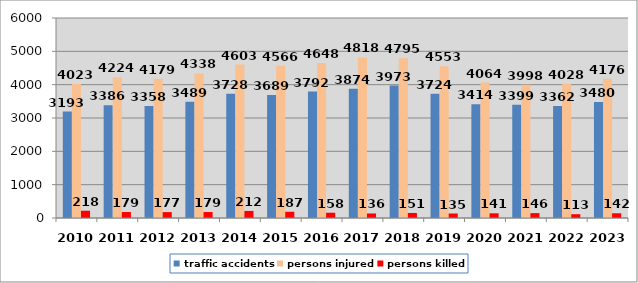
| Category | traffic accidents | persons injured | persons killed |
|---|---|---|---|
| 2010.0 | 3193 | 4023 | 218 |
| 2011.0 | 3386 | 4224 | 179 |
| 2012.0 | 3358 | 4179 | 177 |
| 2013.0 | 3489 | 4338 | 179 |
| 2014.0 | 3728 | 4603 | 212 |
| 2015.0 | 3689 | 4566 | 187 |
| 2016.0 | 3792 | 4648 | 158 |
| 2017.0 | 3874 | 4818 | 136 |
| 2018.0 | 3973 | 4795 | 151 |
| 2019.0 | 3724 | 4553 | 135 |
| 2020.0 | 3414 | 4064 | 141 |
| 2021.0 | 3399 | 3998 | 146 |
| 2022.0 | 3362 | 4028 | 113 |
| 2023.0 | 3480 | 4176 | 142 |